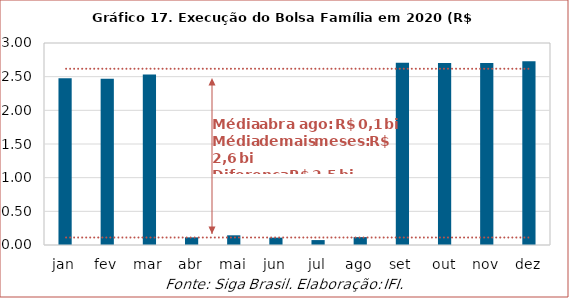
| Category | Execução Bolsa Família |
|---|---|
| jan | 2.476 |
| fev | 2.471 |
| mar | 2.531 |
| abr | 0.113 |
| mai | 0.144 |
| jun | 0.109 |
| jul | 0.073 |
| ago | 0.117 |
| set | 2.707 |
| out | 2.704 |
| nov | 2.704 |
| dez | 2.731 |